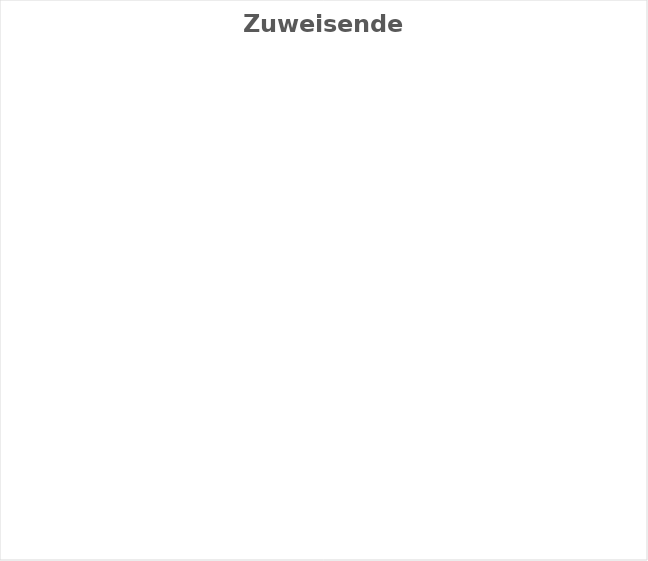
| Category | Series 0 |
|---|---|
| BE | 0 |
| BL | 0 |
| BS | 0 |
| FR | 0 |
| GE | 0 |
| GL | 0 |
| GR | 0 |
| JU | 0 |
| LU | 0 |
| NE | 0 |
| NW | 0 |
| OW | 0 |
| SG  | 0 |
| SH | 0 |
| SO | 0 |
| SZ  | 0 |
| TG | 0 |
| TI | 0 |
| UR  | 0 |
| VD | 0 |
| VS | 0 |
| ZG | 0 |
| ZH | 0 |